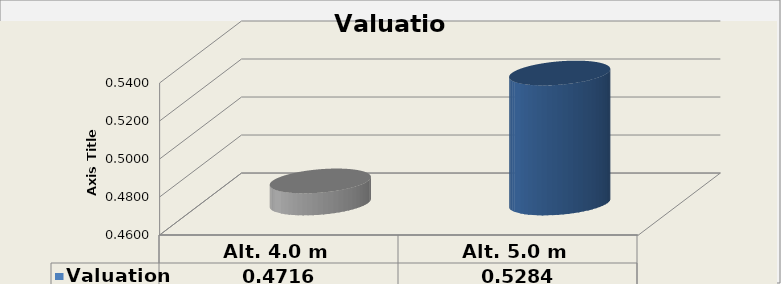
| Category | Valuation |
|---|---|
| Alt. 4.0 m | 0.472 |
| Alt. 5.0 m | 0.528 |